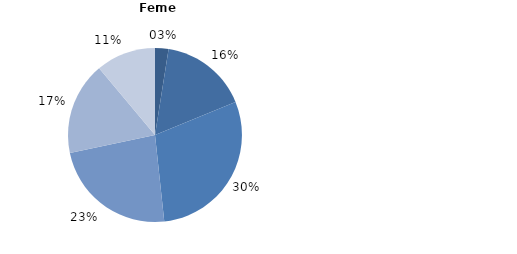
| Category | Series 0 |
|---|---|
| până la 20 ani | 2.5 |
| 20-29 ani | 16.3 |
| 30-39 ani | 29.5 |
| 40-49 ani | 23.4 |
| 50-60 ani | 17.2 |
| 60 și peste | 11.1 |